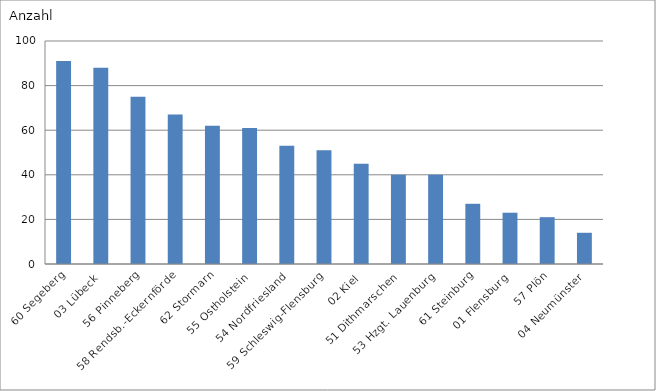
| Category | 60 Segeberg |
|---|---|
| 60 Segeberg | 91 |
| 03 Lübeck | 88 |
| 56 Pinneberg | 75 |
| 58 Rendsb.-Eckernförde | 67 |
| 62 Stormarn | 62 |
| 55 Ostholstein | 61 |
| 54 Nordfriesland | 53 |
| 59 Schleswig-Flensburg | 51 |
| 02 Kiel | 45 |
| 51 Dithmarschen | 40 |
| 53 Hzgt. Lauenburg | 40 |
| 61 Steinburg | 27 |
| 01 Flensburg | 23 |
| 57 Plön | 21 |
| 04 Neumünster | 14 |